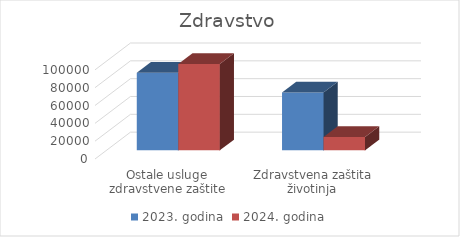
| Category | 2023. godina | 2024. godina |
|---|---|---|
| Ostale usluge zdravstvene zaštite | 87000 | 97000 |
| Zdravstvena zaštita životinja | 65000 | 15000 |